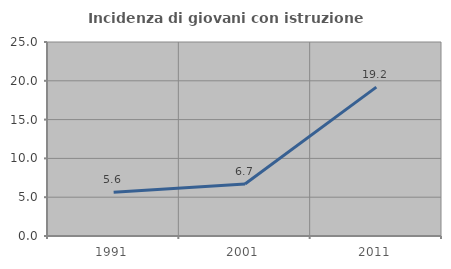
| Category | Incidenza di giovani con istruzione universitaria |
|---|---|
| 1991.0 | 5.628 |
| 2001.0 | 6.693 |
| 2011.0 | 19.184 |